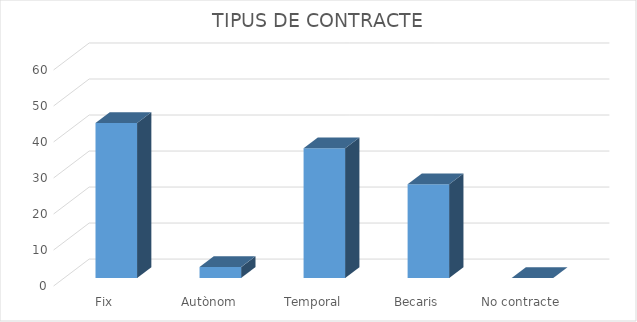
| Category | Series 0 |
|---|---|
| Fix | 43 |
| Autònom | 3 |
| Temporal | 36 |
| Becaris | 26 |
| No contracte | 0 |